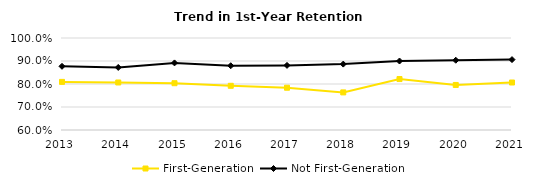
| Category | First-Generation | Not First-Generation |
|---|---|---|
| 2013.0 | 0.809 | 0.877 |
| 2014.0 | 0.807 | 0.872 |
| 2015.0 | 0.803 | 0.892 |
| 2016.0 | 0.792 | 0.879 |
| 2017.0 | 0.784 | 0.881 |
| 2018.0 | 0.763 | 0.887 |
| 2019.0 | 0.821 | 0.9 |
| 2020.0 | 0.796 | 0.903 |
| 2021.0 | 0.806 | 0.906 |